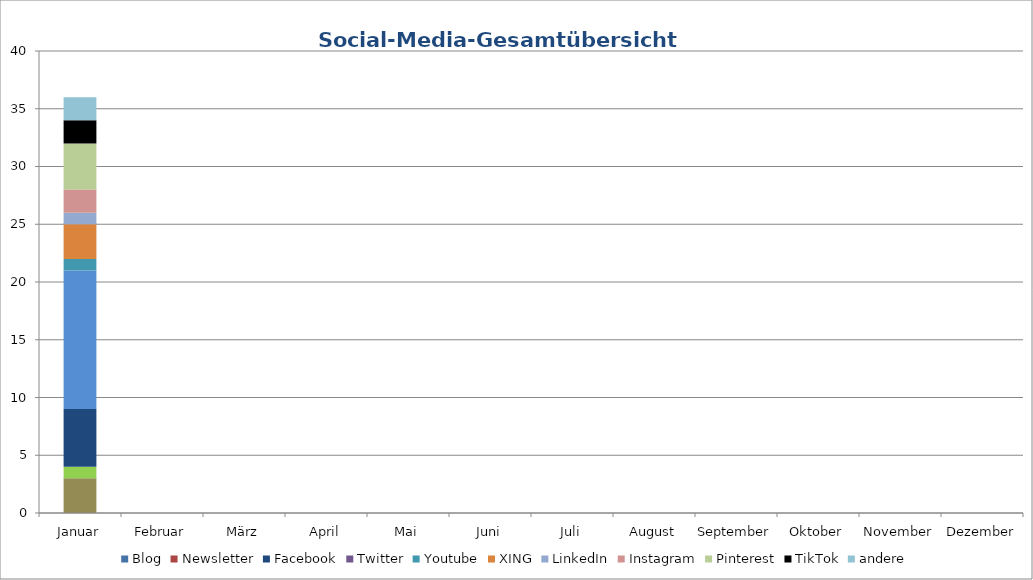
| Category | Blog | Newsletter | Facebook | Twitter | Youtube | XING | LinkedIn | Instagram | Pinterest | TikTok | andere |
|---|---|---|---|---|---|---|---|---|---|---|---|
| Januar | 3 | 1 | 5 | 12 | 1 | 3 | 1 | 2 | 4 | 2 | 2 |
| Februar | 0 | 0 | 0 | 0 | 0 | 0 | 0 | 0 | 0 | 0 | 0 |
| März | 0 | 0 | 0 | 0 | 0 | 0 | 0 | 0 | 0 | 0 | 0 |
| April | 0 | 0 | 0 | 0 | 0 | 0 | 0 | 0 | 0 | 0 | 0 |
| Mai | 0 | 0 | 0 | 0 | 0 | 0 | 0 | 0 | 0 | 0 | 0 |
| Juni | 0 | 0 | 0 | 0 | 0 | 0 | 0 | 0 | 0 | 0 | 0 |
| Juli | 0 | 0 | 0 | 0 | 0 | 0 | 0 | 0 | 0 | 0 | 0 |
| August | 0 | 0 | 0 | 0 | 0 | 0 | 0 | 0 | 0 | 0 | 0 |
| September | 0 | 0 | 0 | 0 | 0 | 0 | 0 | 0 | 0 | 0 | 0 |
| Oktober | 0 | 0 | 0 | 0 | 0 | 0 | 0 | 0 | 0 | 0 | 0 |
| November | 0 | 0 | 0 | 0 | 0 | 0 | 0 | 0 | 0 | 0 | 0 |
| Dezember | 0 | 0 | 0 | 0 | 0 | 0 | 0 | 0 | 0 | 0 | 0 |